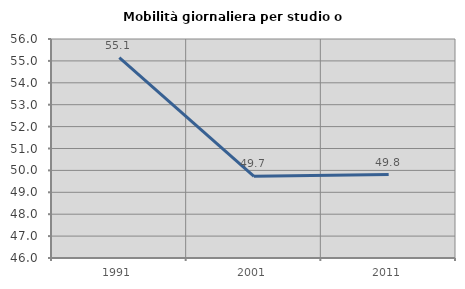
| Category | Mobilità giornaliera per studio o lavoro |
|---|---|
| 1991.0 | 55.147 |
| 2001.0 | 49.733 |
| 2011.0 | 49.81 |